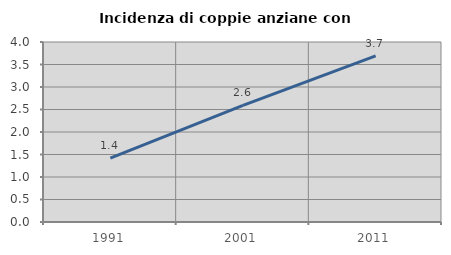
| Category | Incidenza di coppie anziane con figli |
|---|---|
| 1991.0 | 1.42 |
| 2001.0 | 2.594 |
| 2011.0 | 3.693 |